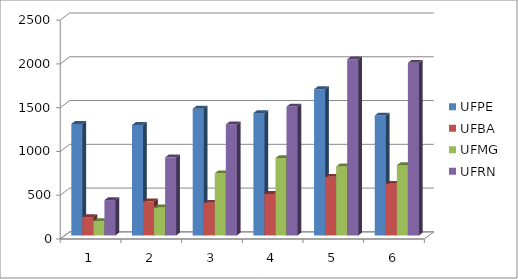
| Category | UFPE | UFBA | UFMG | UFRN |
|---|---|---|---|---|
| 0 | 1274 | 210 | 164 | 404 |
| 1 | 1262 | 390 | 320 | 892 |
| 2 | 1448 | 372 | 710 | 1268 |
| 3 | 1398 | 474 | 884 | 1472 |
| 4 | 1670 | 670 | 788 | 2012 |
| 5 | 1370 | 590 | 803 | 1972 |